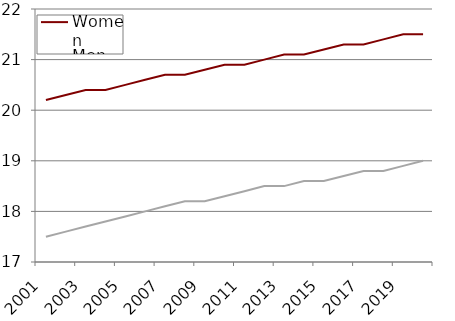
| Category | Women | Men |
|---|---|---|
| 2001.0 | 20.2 | 17.5 |
| 2002.0 | 20.3 | 17.6 |
| 2003.0 | 20.4 | 17.7 |
| 2004.0 | 20.4 | 17.8 |
| 2005.0 | 20.5 | 17.9 |
| 2006.0 | 20.6 | 18 |
| 2007.0 | 20.7 | 18.1 |
| 2008.0 | 20.7 | 18.2 |
| 2009.0 | 20.8 | 18.2 |
| 2010.0 | 20.9 | 18.3 |
| 2011.0 | 20.9 | 18.4 |
| 2012.0 | 21 | 18.5 |
| 2013.0 | 21.1 | 18.5 |
| 2014.0 | 21.1 | 18.6 |
| 2015.0 | 21.2 | 18.6 |
| 2016.0 | 21.3 | 18.7 |
| 2017.0 | 21.3 | 18.8 |
| 2018.0 | 21.4 | 18.8 |
| 2019.0 | 21.5 | 18.9 |
| 2020.0 | 21.5 | 19 |